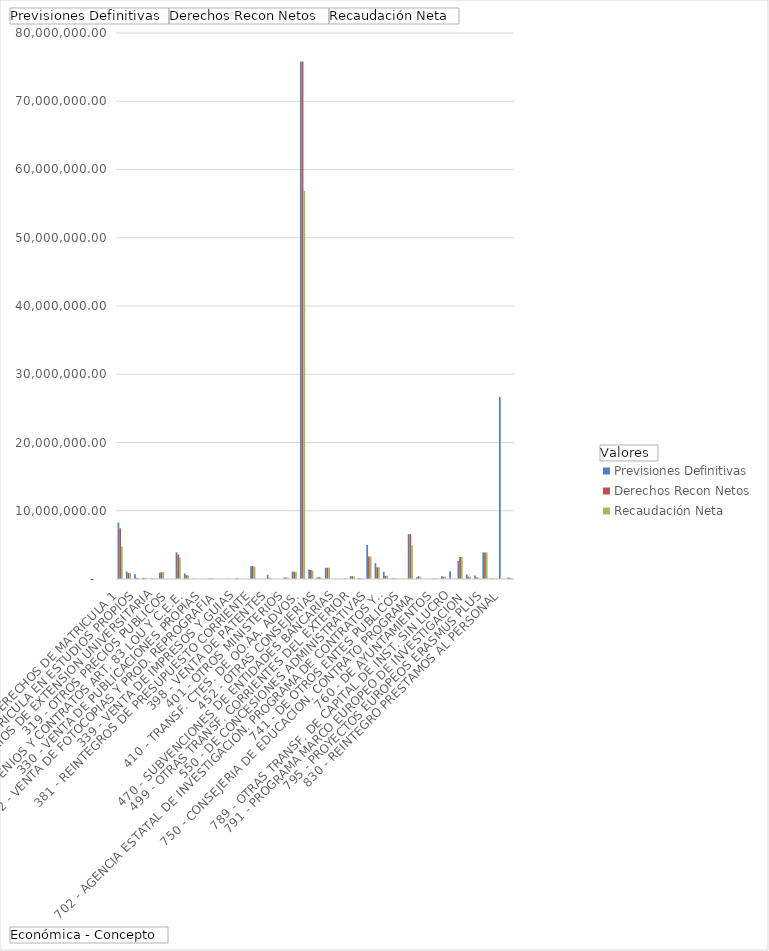
| Category | Previsiones Definitivas | Derechos Recon Netos | Recaudación Neta |
|---|---|---|---|
| 310 - DERECHOS DE MATRICULA 1, 2 Y 3 CICLO | 8260000 | 7413592.43 | 4762121.49 |
| 311 - DERECHOS DE MATRICULA EN ESTUDIOS PROPIOS | 1100000 | 893748.69 | 883668.69 |
| 312 - DERECHOS DE MATRICULA EN C.I.U.C. | 677900 | 163723.65 | 163723.65 |
| 313 - CURSOS Y SEMINARIOS DE EXTENSION UNIVERSITARIA | 184000 | 103859.81 | 103859.81 |
| 314 - OTROS CURSOS Y SEMINARIOS | 141000 | 28539 | 28539 |
| 319 - OTROS PRECIOS PUBLICOS | 943000 | 998480.63 | 998480.63 |
| 327 - USO DE TELEFONOS Y FAX | 15000 | 8196.98 | 7721.61 |
| 328 - CONVENIOS Y CONTRATOS ART. 83 LOU Y C.E.E. | 3900000 | 3584591 | 3118713.84 |
| 329 - OTRAS PRESTACIONES DE SERVICIOS | 821600 | 568275.76 | 540383.7 |
| 330 - VENTA DE PUBLICACIONES PROPIAS | 35000 | 32082.1 | 24784.11 |
| 331 - VENTA DE ENERGIA ELECTRICA | 0 | 19629.78 | 6933.43 |
| 332 - VENTA DE FOTOCOPIAS Y PROD. REPROGRAFIA | 104600 | 66600.35 | 66573.86 |
| 333 - SALAS DE IMPRESION | 15000 | 9153.05 | 9153.05 |
| 339 - VENTA DE IMPRESOS Y GUIAS | 20000 | 36609.39 | 36609.39 |
| 380 - REINTEGROS DE EJERCICIOS CERRADOS | 0 | 117647.57 | 117647.57 |
| 381 - REINTEGROS DE PRESUPUESTO CORRIENTE | 0 | 13733.21 | 13733.21 |
| 390 - RETENCIONES PARA GASTOS GENERALES | 1855000 | 1895215.42 | 1777989.76 |
| 398 - VENTA DE PATENTES | 10000 | 0 | 0 |
| 399 - INGRESOS DIVERSOS | 615595 | 113052.9 | 97417.56 |
| 401 - OTROS MINISTERIOS | 0 | 2325 | 2325 |
| 404 - MINISTERIO DE UNIVERSIDADES | 223660.74 | 223660.74 | 223660.74 |
| 410 - TRANSF. CTES. DE OO.AA. ADVOS. | 1095230.8 | 1050573.8 | 1050573.8 |
| 450 - CONSEJERÍA EDUCACIÓN . CONTRATO PROGRAMA | 75820046 | 75820046 | 56865034.5 |
| 452 - OTRAS CONSEJERIAS | 1388248.85 | 1318268.8 | 1221308.95 |
| 460 - DE AYUNTAMIENTOS PARA CURSOS DE VERANO | 247000 | 250546.98 | 224000 |
| 470 - SUBVENCIONES DE ENTIDADES BANCARIAS | 1650050 | 1645600 | 1645600 |
| 479 - OTRAS TRANSFERENCIAS CORRIENTES | 10000 | 14529 | 14529 |
| 499 - OTRAS TRANSF. CORRIENTES DEL EXTERIOR | 21301.25 | 21301.25 | 21301.25 |
| 540 - ALQUILER Y PRODUCTOS DE INMUEBLES | 400000 | 422819.58 | 379843.14 |
| 550 - DE CONCESIONES ADMINISTRATIVAS | 100000 | 73173.27 | 40314.23 |
| 700 - ADMINISTRACIÓN DEL ESTADO PARA INVESTIGACIÓN | 5003846 | 3306999.97 | 3306999.97 |
| 702 - AGENCIA ESTATAL DE INVESTIGACIÓN. PROGRAMA DE CONTRATOS Y AYUDAS | 2333657 | 1710231.11 | 1710231.11 |
| 704 - MICIU PROGRAMA DE CONTRATOS Y AYUDAS | 1057350 | 459738.75 | 459738.75 |
| 741 - DE OTROS ENTES PUBLICOS | 116717.52 | 116717.52 | 116717.52 |
| 746 - SODERCAN | 8500 | 40039.95 | 40039.95 |
| 750 - CONSEJERIA DE EDUCACION. CONTRATO PROGRAMA | 6570748 | 6570748 | 4928061 |
| 752 - OTRAS CONSEJERIAS | 273303.36 | 404085.28 | 264303.36 |
| 760 - DE AYUNTAMIENTOS | 4000 | 4000 | 4000 |
| 770 - EMPRESAS PRIVADAS | 73454.54 | 73454.54 | 73454.54 |
| 789 - OTRAS TRANSF. DE CAPITAL DE INST. SIN LUCRO | 399438.54 | 330343.54 | 330343.54 |
| 790 - PROGRAMA PLAN ESTATAL FEDER | 1138453 | 0 | 0 |
| 791 - PROGRAMA MARCO EUROPEO DE INVESTIGACION | 2630731.71 | 3218763.96 | 3218763.96 |
| 792 - PROYECTOS EUROPEOS FEDER | 641883.95 | 335412.38 | 335412.38 |
| 795 - PROYECTOS EUROPEOS ERASMUS PLUS | 508817 | 231003.58 | 231003.58 |
| 796 - (SIN DESCRIPCIÓN) | 3893024.3 | 3893024.3 | 3893024.3 |
| 830 - REINTEGRO PRESTAMOS AL PERSONAL | 100000 | 32261.7 | 32261.7 |
| 870 - REMANENTE DE TESORERIA | 26667587.42 | 0 | 0 |
| 911 - ANTICIPOS REEMBOLSABLES A LARGO PLAZO ENTES S.P. | 218985 | 168167.16 | 168167.16 |